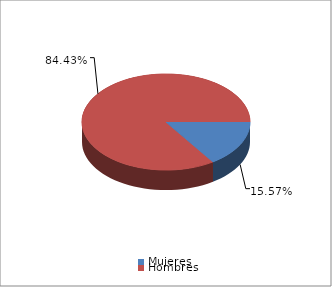
| Category | Series 0 |
|---|---|
| Mujeres | 3212 |
| Hombres | 17417 |